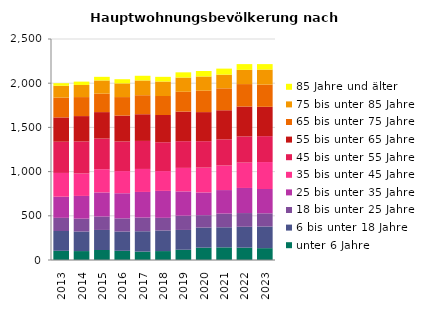
| Category | unter 6 Jahre | 6 bis unter 18 Jahre | 18 bis unter 25 Jahre | 25 bis unter 35 Jahre | 35 bis unter 45 Jahre | 45 bis unter 55 Jahre | 55 bis unter 65 Jahre | 65 bis unter 75 Jahre | 75 bis unter 85 Jahre | 85 Jahre und älter |
|---|---|---|---|---|---|---|---|---|---|---|
| 2013.0 | 104 | 224 | 149 | 239 | 269 | 353 | 275 | 224 | 134 | 29 |
| 2014.0 | 101 | 221 | 146 | 257 | 254 | 362 | 287 | 215 | 137 | 38 |
| 2015.0 | 113 | 227 | 152 | 272 | 263 | 347 | 299 | 209 | 149 | 41 |
| 2016.0 | 104 | 218 | 149 | 284 | 251 | 335 | 293 | 209 | 155 | 47 |
| 2017.0 | 95 | 230 | 155 | 290 | 260 | 317 | 302 | 215 | 167 | 53 |
| 2018.0 | 101 | 233 | 143 | 305 | 224 | 326 | 308 | 215 | 164 | 53 |
| 2019.0 | 116 | 224 | 161 | 275 | 266 | 302 | 335 | 224 | 161 | 59 |
| 2020.0 | 140 | 227 | 140 | 257 | 281 | 299 | 329 | 242 | 161 | 62 |
| 2021.0 | 143 | 227 | 155 | 266 | 278 | 296 | 329 | 248 | 155 | 68 |
| 2022.0 | 140 | 236 | 155 | 284 | 287 | 296 | 338 | 254 | 161 | 65 |
| 2023.0 | 134 | 245 | 149 | 275 | 305 | 293 | 332 | 251 | 170 | 62 |